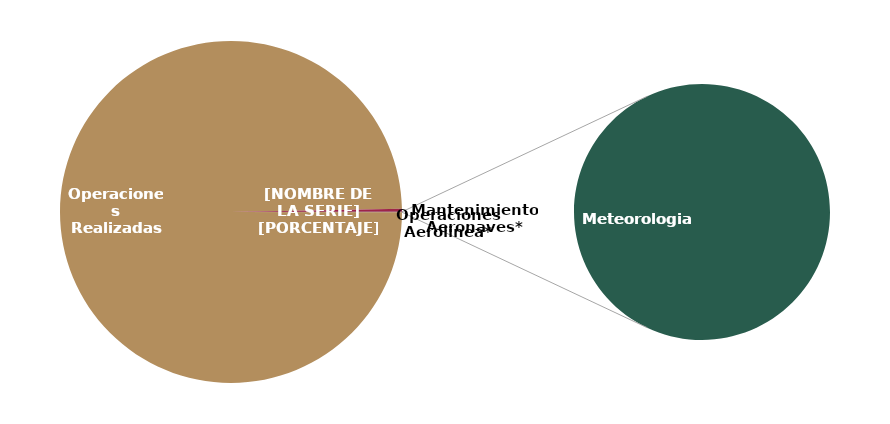
| Category | Cancelaciones |
|---|---|
| Operaciones Realizadas | 5698 |
|    Operaciones Aerolinea* | 15 |
|    Mantenimiento Aeronaves* | 1 |
|    Otras Imputables | 0 |
|    Meteorologia | 2 |
|    Otras No Imputables | 0 |